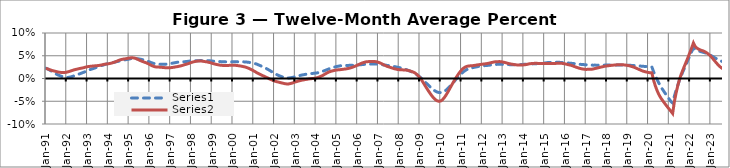
| Category | Series 0 | Series 1 |
|---|---|---|
| 1991-01-01 | 0.023 | 0.022 |
| 1991-02-01 | 0.021 | 0.021 |
| 1991-03-01 | 0.019 | 0.02 |
| 1991-04-01 | 0.017 | 0.018 |
| 1991-05-01 | 0.015 | 0.017 |
| 1991-06-01 | 0.012 | 0.016 |
| 1991-07-01 | 0.01 | 0.015 |
| 1991-08-01 | 0.008 | 0.014 |
| 1991-09-01 | 0.006 | 0.014 |
| 1991-10-01 | 0.005 | 0.013 |
| 1991-11-01 | 0.004 | 0.013 |
| 1991-12-01 | 0.003 | 0.013 |
| 1992-01-01 | 0.002 | 0.014 |
| 1992-02-01 | 0.002 | 0.015 |
| 1992-03-01 | 0.003 | 0.016 |
| 1992-04-01 | 0.004 | 0.017 |
| 1992-05-01 | 0.005 | 0.019 |
| 1992-06-01 | 0.007 | 0.02 |
| 1992-07-01 | 0.008 | 0.021 |
| 1992-08-01 | 0.01 | 0.022 |
| 1992-09-01 | 0.011 | 0.022 |
| 1992-10-01 | 0.012 | 0.023 |
| 1992-11-01 | 0.014 | 0.024 |
| 1992-12-01 | 0.015 | 0.025 |
| 1993-01-01 | 0.017 | 0.026 |
| 1993-02-01 | 0.019 | 0.026 |
| 1993-03-01 | 0.02 | 0.027 |
| 1993-04-01 | 0.021 | 0.027 |
| 1993-05-01 | 0.023 | 0.028 |
| 1993-06-01 | 0.024 | 0.028 |
| 1993-07-01 | 0.026 | 0.028 |
| 1993-08-01 | 0.027 | 0.029 |
| 1993-09-01 | 0.028 | 0.03 |
| 1993-10-01 | 0.029 | 0.03 |
| 1993-11-01 | 0.031 | 0.031 |
| 1993-12-01 | 0.032 | 0.032 |
| 1994-01-01 | 0.033 | 0.032 |
| 1994-02-01 | 0.033 | 0.033 |
| 1994-03-01 | 0.034 | 0.034 |
| 1994-04-01 | 0.035 | 0.035 |
| 1994-05-01 | 0.036 | 0.036 |
| 1994-06-01 | 0.037 | 0.038 |
| 1994-07-01 | 0.038 | 0.04 |
| 1994-08-01 | 0.039 | 0.041 |
| 1994-09-01 | 0.04 | 0.042 |
| 1994-10-01 | 0.04 | 0.043 |
| 1994-11-01 | 0.041 | 0.043 |
| 1994-12-01 | 0.042 | 0.044 |
| 1995-01-01 | 0.043 | 0.045 |
| 1995-02-01 | 0.044 | 0.045 |
| 1995-03-01 | 0.044 | 0.046 |
| 1995-04-01 | 0.044 | 0.045 |
| 1995-05-01 | 0.044 | 0.044 |
| 1995-06-01 | 0.043 | 0.042 |
| 1995-07-01 | 0.043 | 0.04 |
| 1995-08-01 | 0.042 | 0.039 |
| 1995-09-01 | 0.041 | 0.037 |
| 1995-10-01 | 0.04 | 0.036 |
| 1995-11-01 | 0.039 | 0.034 |
| 1995-12-01 | 0.038 | 0.033 |
| 1996-01-01 | 0.036 | 0.031 |
| 1996-02-01 | 0.035 | 0.029 |
| 1996-03-01 | 0.033 | 0.027 |
| 1996-04-01 | 0.032 | 0.026 |
| 1996-05-01 | 0.032 | 0.025 |
| 1996-06-01 | 0.031 | 0.025 |
| 1996-07-01 | 0.031 | 0.025 |
| 1996-08-01 | 0.031 | 0.025 |
| 1996-09-01 | 0.031 | 0.024 |
| 1996-10-01 | 0.031 | 0.024 |
| 1996-11-01 | 0.032 | 0.024 |
| 1996-12-01 | 0.032 | 0.023 |
| 1997-01-01 | 0.033 | 0.024 |
| 1997-02-01 | 0.034 | 0.024 |
| 1997-03-01 | 0.034 | 0.025 |
| 1997-04-01 | 0.035 | 0.026 |
| 1997-05-01 | 0.036 | 0.026 |
| 1997-06-01 | 0.036 | 0.027 |
| 1997-07-01 | 0.036 | 0.028 |
| 1997-08-01 | 0.037 | 0.029 |
| 1997-09-01 | 0.037 | 0.03 |
| 1997-10-01 | 0.037 | 0.031 |
| 1997-11-01 | 0.038 | 0.032 |
| 1997-12-01 | 0.038 | 0.034 |
| 1998-01-01 | 0.039 | 0.035 |
| 1998-02-01 | 0.039 | 0.036 |
| 1998-03-01 | 0.039 | 0.037 |
| 1998-04-01 | 0.039 | 0.038 |
| 1998-05-01 | 0.039 | 0.038 |
| 1998-06-01 | 0.039 | 0.038 |
| 1998-07-01 | 0.039 | 0.038 |
| 1998-08-01 | 0.04 | 0.038 |
| 1998-09-01 | 0.04 | 0.037 |
| 1998-10-01 | 0.039 | 0.037 |
| 1998-11-01 | 0.039 | 0.036 |
| 1998-12-01 | 0.039 | 0.035 |
| 1999-01-01 | 0.038 | 0.033 |
| 1999-02-01 | 0.038 | 0.032 |
| 1999-03-01 | 0.038 | 0.031 |
| 1999-04-01 | 0.038 | 0.031 |
| 1999-05-01 | 0.037 | 0.03 |
| 1999-06-01 | 0.037 | 0.029 |
| 1999-07-01 | 0.037 | 0.029 |
| 1999-08-01 | 0.037 | 0.029 |
| 1999-09-01 | 0.037 | 0.029 |
| 1999-10-01 | 0.037 | 0.029 |
| 1999-11-01 | 0.037 | 0.029 |
| 1999-12-01 | 0.037 | 0.029 |
| 2000-01-01 | 0.037 | 0.029 |
| 2000-02-01 | 0.037 | 0.029 |
| 2000-03-01 | 0.037 | 0.029 |
| 2000-04-01 | 0.037 | 0.028 |
| 2000-05-01 | 0.037 | 0.028 |
| 2000-06-01 | 0.037 | 0.027 |
| 2000-07-01 | 0.037 | 0.026 |
| 2000-08-01 | 0.036 | 0.025 |
| 2000-09-01 | 0.036 | 0.024 |
| 2000-10-01 | 0.036 | 0.023 |
| 2000-11-01 | 0.035 | 0.021 |
| 2000-12-01 | 0.034 | 0.019 |
| 2001-01-01 | 0.034 | 0.017 |
| 2001-02-01 | 0.033 | 0.015 |
| 2001-03-01 | 0.031 | 0.012 |
| 2001-04-01 | 0.03 | 0.01 |
| 2001-05-01 | 0.028 | 0.008 |
| 2001-06-01 | 0.026 | 0.007 |
| 2001-07-01 | 0.024 | 0.005 |
| 2001-08-01 | 0.023 | 0.003 |
| 2001-09-01 | 0.02 | 0.001 |
| 2001-10-01 | 0.018 | -0.001 |
| 2001-11-01 | 0.016 | -0.002 |
| 2001-12-01 | 0.014 | -0.004 |
| 2002-01-01 | 0.011 | -0.006 |
| 2002-02-01 | 0.009 | -0.007 |
| 2002-03-01 | 0.007 | -0.008 |
| 2002-04-01 | 0.006 | -0.009 |
| 2002-05-01 | 0.004 | -0.01 |
| 2002-06-01 | 0.003 | -0.01 |
| 2002-07-01 | 0.002 | -0.011 |
| 2002-08-01 | 0.001 | -0.012 |
| 2002-09-01 | 0.001 | -0.012 |
| 2002-10-01 | 0.001 | -0.011 |
| 2002-11-01 | 0.002 | -0.01 |
| 2002-12-01 | 0.003 | -0.009 |
| 2003-01-01 | 0.004 | -0.008 |
| 2003-02-01 | 0.005 | -0.007 |
| 2003-03-01 | 0.006 | -0.005 |
| 2003-04-01 | 0.007 | -0.004 |
| 2003-05-01 | 0.008 | -0.004 |
| 2003-06-01 | 0.008 | -0.003 |
| 2003-07-01 | 0.009 | -0.002 |
| 2003-08-01 | 0.01 | -0.002 |
| 2003-09-01 | 0.01 | -0.001 |
| 2003-10-01 | 0.011 | -0.001 |
| 2003-11-01 | 0.011 | 0 |
| 2003-12-01 | 0.012 | 0 |
| 2004-01-01 | 0.012 | 0.001 |
| 2004-02-01 | 0.013 | 0.002 |
| 2004-03-01 | 0.013 | 0.003 |
| 2004-04-01 | 0.015 | 0.005 |
| 2004-05-01 | 0.016 | 0.007 |
| 2004-06-01 | 0.017 | 0.009 |
| 2004-07-01 | 0.019 | 0.011 |
| 2004-08-01 | 0.02 | 0.013 |
| 2004-09-01 | 0.022 | 0.015 |
| 2004-10-01 | 0.023 | 0.016 |
| 2004-11-01 | 0.024 | 0.017 |
| 2004-12-01 | 0.025 | 0.018 |
| 2005-01-01 | 0.026 | 0.019 |
| 2005-02-01 | 0.027 | 0.019 |
| 2005-03-01 | 0.028 | 0.019 |
| 2005-04-01 | 0.028 | 0.02 |
| 2005-05-01 | 0.028 | 0.021 |
| 2005-06-01 | 0.029 | 0.021 |
| 2005-07-01 | 0.029 | 0.022 |
| 2005-08-01 | 0.029 | 0.022 |
| 2005-09-01 | 0.029 | 0.023 |
| 2005-10-01 | 0.029 | 0.025 |
| 2005-11-01 | 0.029 | 0.026 |
| 2005-12-01 | 0.029 | 0.028 |
| 2006-01-01 | 0.03 | 0.03 |
| 2006-02-01 | 0.03 | 0.031 |
| 2006-03-01 | 0.03 | 0.033 |
| 2006-04-01 | 0.031 | 0.035 |
| 2006-05-01 | 0.031 | 0.036 |
| 2006-06-01 | 0.031 | 0.037 |
| 2006-07-01 | 0.031 | 0.037 |
| 2006-08-01 | 0.032 | 0.037 |
| 2006-09-01 | 0.032 | 0.037 |
| 2006-10-01 | 0.032 | 0.038 |
| 2006-11-01 | 0.032 | 0.037 |
| 2006-12-01 | 0.032 | 0.037 |
| 2007-01-01 | 0.031 | 0.036 |
| 2007-02-01 | 0.031 | 0.034 |
| 2007-03-01 | 0.031 | 0.032 |
| 2007-04-01 | 0.03 | 0.03 |
| 2007-05-01 | 0.029 | 0.029 |
| 2007-06-01 | 0.029 | 0.027 |
| 2007-07-01 | 0.028 | 0.026 |
| 2007-08-01 | 0.028 | 0.024 |
| 2007-09-01 | 0.027 | 0.023 |
| 2007-10-01 | 0.026 | 0.022 |
| 2007-11-01 | 0.026 | 0.021 |
| 2007-12-01 | 0.025 | 0.02 |
| 2008-01-01 | 0.024 | 0.019 |
| 2008-02-01 | 0.023 | 0.019 |
| 2008-03-01 | 0.022 | 0.019 |
| 2008-04-01 | 0.021 | 0.019 |
| 2008-05-01 | 0.02 | 0.019 |
| 2008-06-01 | 0.018 | 0.018 |
| 2008-07-01 | 0.017 | 0.017 |
| 2008-08-01 | 0.015 | 0.016 |
| 2008-09-01 | 0.013 | 0.014 |
| 2008-10-01 | 0.011 | 0.013 |
| 2008-11-01 | 0.009 | 0.01 |
| 2008-12-01 | 0.006 | 0.006 |
| 2009-01-01 | 0.003 | 0.002 |
| 2009-02-01 | 0 | -0.003 |
| 2009-03-01 | -0.004 | -0.009 |
| 2009-04-01 | -0.008 | -0.016 |
| 2009-05-01 | -0.011 | -0.022 |
| 2009-06-01 | -0.015 | -0.028 |
| 2009-07-01 | -0.019 | -0.033 |
| 2009-08-01 | -0.022 | -0.038 |
| 2009-09-01 | -0.025 | -0.043 |
| 2009-10-01 | -0.028 | -0.047 |
| 2009-11-01 | -0.03 | -0.049 |
| 2009-12-01 | -0.031 | -0.05 |
| 2010-01-01 | -0.031 | -0.049 |
| 2010-02-01 | -0.03 | -0.047 |
| 2010-03-01 | -0.029 | -0.043 |
| 2010-04-01 | -0.026 | -0.037 |
| 2010-05-01 | -0.023 | -0.031 |
| 2010-06-01 | -0.019 | -0.024 |
| 2010-07-01 | -0.014 | -0.017 |
| 2010-08-01 | -0.01 | -0.01 |
| 2010-09-01 | -0.006 | -0.004 |
| 2010-10-01 | -0.001 | 0.002 |
| 2010-11-01 | 0.003 | 0.008 |
| 2010-12-01 | 0.007 | 0.014 |
| 2011-01-01 | 0.011 | 0.018 |
| 2011-02-01 | 0.014 | 0.022 |
| 2011-03-01 | 0.017 | 0.025 |
| 2011-04-01 | 0.019 | 0.026 |
| 2011-05-01 | 0.021 | 0.027 |
| 2011-06-01 | 0.022 | 0.028 |
| 2011-07-01 | 0.023 | 0.028 |
| 2011-08-01 | 0.024 | 0.028 |
| 2011-09-01 | 0.025 | 0.029 |
| 2011-10-01 | 0.026 | 0.03 |
| 2011-11-01 | 0.027 | 0.03 |
| 2011-12-01 | 0.027 | 0.031 |
| 2012-01-01 | 0.028 | 0.031 |
| 2012-02-01 | 0.028 | 0.032 |
| 2012-03-01 | 0.028 | 0.032 |
| 2012-04-01 | 0.029 | 0.033 |
| 2012-05-01 | 0.029 | 0.034 |
| 2012-06-01 | 0.03 | 0.035 |
| 2012-07-01 | 0.03 | 0.036 |
| 2012-08-01 | 0.031 | 0.036 |
| 2012-09-01 | 0.031 | 0.037 |
| 2012-10-01 | 0.031 | 0.037 |
| 2012-11-01 | 0.031 | 0.037 |
| 2012-12-01 | 0.031 | 0.037 |
| 2013-01-01 | 0.031 | 0.036 |
| 2013-02-01 | 0.031 | 0.035 |
| 2013-03-01 | 0.031 | 0.034 |
| 2013-04-01 | 0.031 | 0.033 |
| 2013-05-01 | 0.03 | 0.032 |
| 2013-06-01 | 0.03 | 0.032 |
| 2013-07-01 | 0.03 | 0.031 |
| 2013-08-01 | 0.03 | 0.03 |
| 2013-09-01 | 0.03 | 0.03 |
| 2013-10-01 | 0.03 | 0.03 |
| 2013-11-01 | 0.03 | 0.03 |
| 2013-12-01 | 0.031 | 0.03 |
| 2014-01-01 | 0.031 | 0.03 |
| 2014-02-01 | 0.031 | 0.03 |
| 2014-03-01 | 0.031 | 0.031 |
| 2014-04-01 | 0.032 | 0.032 |
| 2014-05-01 | 0.032 | 0.033 |
| 2014-06-01 | 0.032 | 0.033 |
| 2014-07-01 | 0.032 | 0.033 |
| 2014-08-01 | 0.032 | 0.033 |
| 2014-09-01 | 0.033 | 0.033 |
| 2014-10-01 | 0.033 | 0.033 |
| 2014-11-01 | 0.033 | 0.033 |
| 2014-12-01 | 0.034 | 0.033 |
| 2015-01-01 | 0.034 | 0.033 |
| 2015-02-01 | 0.035 | 0.033 |
| 2015-03-01 | 0.035 | 0.033 |
| 2015-04-01 | 0.035 | 0.033 |
| 2015-05-01 | 0.035 | 0.033 |
| 2015-06-01 | 0.035 | 0.033 |
| 2015-07-01 | 0.036 | 0.033 |
| 2015-08-01 | 0.036 | 0.033 |
| 2015-09-01 | 0.036 | 0.034 |
| 2015-10-01 | 0.035 | 0.034 |
| 2015-11-01 | 0.035 | 0.033 |
| 2015-12-01 | 0.035 | 0.033 |
| 2016-01-01 | 0.035 | 0.032 |
| 2016-02-01 | 0.034 | 0.031 |
| 2016-03-01 | 0.034 | 0.03 |
| 2016-04-01 | 0.033 | 0.029 |
| 2016-05-01 | 0.033 | 0.028 |
| 2016-06-01 | 0.033 | 0.027 |
| 2016-07-01 | 0.032 | 0.025 |
| 2016-08-01 | 0.032 | 0.024 |
| 2016-09-01 | 0.031 | 0.023 |
| 2016-10-01 | 0.031 | 0.022 |
| 2016-11-01 | 0.031 | 0.021 |
| 2016-12-01 | 0.03 | 0.02 |
| 2017-01-01 | 0.03 | 0.02 |
| 2017-02-01 | 0.03 | 0.02 |
| 2017-03-01 | 0.03 | 0.02 |
| 2017-04-01 | 0.03 | 0.02 |
| 2017-05-01 | 0.029 | 0.021 |
| 2017-06-01 | 0.029 | 0.022 |
| 2017-07-01 | 0.029 | 0.023 |
| 2017-08-01 | 0.029 | 0.024 |
| 2017-09-01 | 0.029 | 0.025 |
| 2017-10-01 | 0.029 | 0.025 |
| 2017-11-01 | 0.029 | 0.026 |
| 2017-12-01 | 0.029 | 0.027 |
| 2018-01-01 | 0.03 | 0.028 |
| 2018-02-01 | 0.03 | 0.028 |
| 2018-03-01 | 0.03 | 0.029 |
| 2018-04-01 | 0.029 | 0.029 |
| 2018-05-01 | 0.03 | 0.029 |
| 2018-06-01 | 0.029 | 0.03 |
| 2018-07-01 | 0.029 | 0.03 |
| 2018-08-01 | 0.03 | 0.03 |
| 2018-09-01 | 0.03 | 0.03 |
| 2018-10-01 | 0.03 | 0.03 |
| 2018-11-01 | 0.03 | 0.03 |
| 2018-12-01 | 0.029 | 0.029 |
| 2019-01-01 | 0.029 | 0.029 |
| 2019-02-01 | 0.029 | 0.028 |
| 2019-03-01 | 0.029 | 0.027 |
| 2019-04-01 | 0.029 | 0.026 |
| 2019-05-01 | 0.028 | 0.024 |
| 2019-06-01 | 0.028 | 0.023 |
| 2019-07-01 | 0.028 | 0.021 |
| 2019-08-01 | 0.027 | 0.019 |
| 2019-09-01 | 0.027 | 0.017 |
| 2019-10-01 | 0.027 | 0.016 |
| 2019-11-01 | 0.027 | 0.015 |
| 2019-12-01 | 0.026 | 0.014 |
| 2020-01-01 | 0.026 | 0.013 |
| 2020-02-01 | 0.026 | 0.013 |
| 2020-03-01 | 0.025 | 0.012 |
| 2020-04-01 | 0.015 | -0.004 |
| 2020-05-01 | 0.006 | -0.016 |
| 2020-06-01 | -0.002 | -0.027 |
| 2020-07-01 | -0.01 | -0.035 |
| 2020-08-01 | -0.017 | -0.042 |
| 2020-09-01 | -0.023 | -0.047 |
| 2020-10-01 | -0.029 | -0.053 |
| 2020-11-01 | -0.034 | -0.058 |
| 2020-12-01 | -0.04 | -0.063 |
| 2021-01-01 | -0.045 | -0.067 |
| 2021-02-01 | -0.05 | -0.072 |
| 2021-03-01 | -0.054 | -0.077 |
| 2021-04-01 | -0.039 | -0.051 |
| 2021-05-01 | -0.026 | -0.032 |
| 2021-06-01 | -0.015 | -0.015 |
| 2021-07-01 | -0.003 | -0.001 |
| 2021-08-01 | 0.006 | 0.01 |
| 2021-09-01 | 0.016 | 0.02 |
| 2021-10-01 | 0.024 | 0.029 |
| 2021-11-01 | 0.033 | 0.038 |
| 2021-12-01 | 0.042 | 0.048 |
| 2022-01-01 | 0.051 | 0.057 |
| 2022-02-01 | 0.06 | 0.068 |
| 2022-03-01 | 0.067 | 0.078 |
| 2022-04-01 | 0.064 | 0.07 |
| 2022-05-01 | 0.062 | 0.067 |
| 2022-06-01 | 0.061 | 0.064 |
| 2022-07-01 | 0.059 | 0.063 |
| 2022-08-01 | 0.058 | 0.061 |
| 2022-09-01 | 0.057 | 0.06 |
| 2022-10-01 | 0.056 | 0.058 |
| 2022-11-01 | 0.055 | 0.056 |
| 2022-12-01 | 0.053 | 0.052 |
| 2023-01-01 | 0.051 | 0.049 |
| 2023-02-01 | 0.049 | 0.045 |
| 2023-03-01 | 0.046 | 0.04 |
| 2023-04-01 | 0.044 | 0.035 |
| 2023-05-01 | 0.042 | 0.031 |
| 2023-06-01 | 0.04 | 0.027 |
| 2023-07-01 | 0.038 | 0.024 |
| 2023-08-01 | 0.037 | 0.021 |
| 2023-09-01 | 0.035 | 0.02 |
| 2023-10-01 | 0.034 | 0.019 |
| 2023-11-01 | 0.033 | 0.018 |
| 2023-12-01 | 0.032 | 0.018 |
| 2024-01-01 | 0.031 | 0.017 |
| 2024-02-01 | 0.031 | 0.018 |